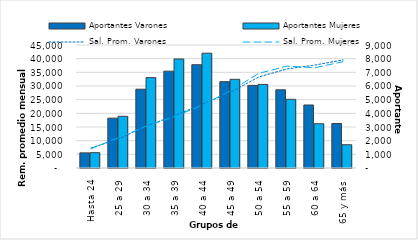
| Category | Aportantes Varones | Aportantes Mujeres |
|---|---|---|
| 0 | 1106 | 1122 |
| 1 | 3645 | 3783 |
| 2 | 5766 | 6615 |
| 3 | 7086 | 7978 |
| 4 | 7558 | 8401 |
| 5 | 6317 | 6489 |
| 6 | 6044 | 6115 |
| 7 | 5722 | 5025 |
| 8 | 4610 | 3240 |
| 9 | 3255 | 1703 |